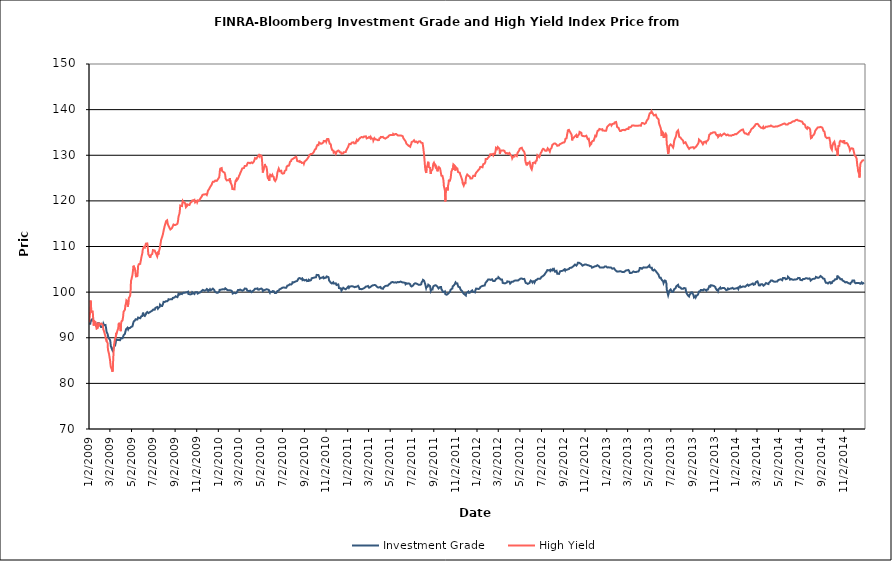
| Category | Investment Grade | High Yield |
|---|---|---|
| 1/2/09 | 93.046 | 93.384 |
| 1/5/09 | 93.049 | 95.884 |
| 1/6/09 | 93.475 | 98.139 |
| 1/7/09 | 93.709 | 97.71 |
| 1/8/09 | 93.718 | 95.533 |
| 1/9/09 | 93.985 | 95.816 |
| 1/12/09 | 94.097 | 95.762 |
| 1/13/09 | 93.983 | 94.686 |
| 1/14/09 | 93.92 | 93.286 |
| 1/15/09 | 93.546 | 92.655 |
| 1/16/09 | 93.671 | 93.669 |
| 1/20/09 | 93.14 | 93.418 |
| 1/21/09 | 92.925 | 93.023 |
| 1/22/09 | 92.583 | 92.395 |
| 1/23/09 | 92.491 | 91.995 |
| 1/26/09 | 92.535 | 92.134 |
| 1/27/09 | 92.931 | 92.144 |
| 1/28/09 | 93.364 | 93.304 |
| 1/29/09 | 93.001 | 93.191 |
| 1/30/09 | 92.791 | 92.696 |
| 2/2/09 | 92.882 | 92.996 |
| 2/3/09 | 92.637 | 92.918 |
| 2/4/09 | 92.379 | 93.053 |
| 2/5/09 | 92.294 | 93.127 |
| 2/6/09 | 92.318 | 93.083 |
| 2/9/09 | 92.344 | 92.836 |
| 2/10/09 | 92.826 | 92.698 |
| 2/11/09 | 93.112 | 91.824 |
| 2/12/09 | 93.017 | 91.606 |
| 2/13/09 | 92.764 | 91.393 |
| 2/17/09 | 92.806 | 90.299 |
| 2/18/09 | 92.404 | 89.67 |
| 2/19/09 | 91.948 | 89.9 |
| 2/20/09 | 91.302 | 89.233 |
| 2/23/09 | 90.863 | 88.885 |
| 2/24/09 | 90.44 | 87.376 |
| 2/25/09 | 90.154 | 87.339 |
| 2/26/09 | 89.975 | 87.524 |
| 2/27/09 | 89.852 | 86.478 |
| 3/2/09 | 89.476 | 85.02 |
| 3/3/09 | 89.055 | 84.259 |
| 3/4/09 | 88.198 | 83.636 |
| 3/5/09 | 87.979 | 83.569 |
| 3/6/09 | 87.845 | 83.252 |
| 3/9/09 | 87.196 | 82.542 |
| 3/10/09 | 87.218 | 83.855 |
| 3/11/09 | 87.46 | 85.554 |
| 3/12/09 | 87.764 | 87.06 |
| 3/13/09 | 88.258 | 88.329 |
| 3/16/09 | 88.272 | 89.854 |
| 3/17/09 | 88.372 | 89.896 |
| 3/18/09 | 88.919 | 90.118 |
| 3/19/09 | 89.64 | 91.095 |
| 3/20/09 | 89.443 | 90.814 |
| 3/23/09 | 89.512 | 91.642 |
| 3/24/09 | 89.466 | 91.703 |
| 3/25/09 | 89.433 | 92.049 |
| 3/26/09 | 89.521 | 92.951 |
| 3/27/09 | 89.705 | 93.274 |
| 3/30/09 | 89.455 | 92.469 |
| 3/31/09 | 89.615 | 92.327 |
| 4/1/09 | 89.672 | 91.447 |
| 4/2/09 | 89.883 | 93.017 |
| 4/3/09 | 89.748 | 93.575 |
| 4/6/09 | 89.88 | 93.801 |
| 4/7/09 | 89.967 | 94.252 |
| 4/8/09 | 90.298 | 94.749 |
| 4/9/09 | 90.527 | 95.685 |
| 4/13/09 | 90.891 | 96.175 |
| 4/14/09 | 91.268 | 97.038 |
| 4/15/09 | 91.545 | 96.985 |
| 4/16/09 | 91.842 | 97.579 |
| 4/17/09 | 92.015 | 98.223 |
| 4/20/09 | 92.183 | 98.037 |
| 4/21/09 | 92.024 | 96.806 |
| 4/22/09 | 91.82 | 97.228 |
| 4/23/09 | 91.922 | 97.456 |
| 4/24/09 | 92.114 | 98.694 |
| 4/27/09 | 92.136 | 99.12 |
| 4/28/09 | 92.124 | 99.355 |
| 4/29/09 | 92.267 | 100.493 |
| 4/30/09 | 92.365 | 102.465 |
| 5/1/09 | 92.375 | 102.702 |
| 5/4/09 | 92.495 | 103.726 |
| 5/5/09 | 92.789 | 104.282 |
| 5/6/09 | 93.129 | 105.004 |
| 5/7/09 | 93.372 | 105.794 |
| 5/8/09 | 93.6 | 105.722 |
| 5/11/09 | 93.779 | 105.05 |
| 5/12/09 | 93.96 | 104.733 |
| 5/13/09 | 94.041 | 104.064 |
| 5/14/09 | 93.916 | 103.447 |
| 5/15/09 | 94.086 | 103.407 |
| 5/18/09 | 94 | 103.509 |
| 5/19/09 | 94.058 | 104.332 |
| 5/20/09 | 94.43 | 105.679 |
| 5/21/09 | 94.416 | 105.772 |
| 5/22/09 | 94.366 | 106.114 |
| 5/26/09 | 94.273 | 106.193 |
| 5/27/09 | 94.248 | 106.702 |
| 5/28/09 | 94.182 | 106.98 |
| 5/29/09 | 94.698 | 107.538 |
| 6/1/09 | 94.766 | 108.487 |
| 6/2/09 | 95.131 | 109.26 |
| 6/3/09 | 95.498 | 109.24 |
| 6/4/09 | 95.301 | 109.279 |
| 6/5/09 | 94.935 | 109.888 |
| 6/8/09 | 94.77 | 109.759 |
| 6/9/09 | 94.929 | 109.861 |
| 6/10/09 | 94.939 | 110.333 |
| 6/11/09 | 95.142 | 110.634 |
| 6/12/09 | 95.402 | 110.815 |
| 6/15/09 | 95.623 | 110.676 |
| 6/16/09 | 95.67 | 110.228 |
| 6/17/09 | 95.691 | 109.146 |
| 6/18/09 | 95.399 | 108.309 |
| 6/19/09 | 95.443 | 108.448 |
| 6/22/09 | 95.594 | 107.775 |
| 6/23/09 | 95.659 | 107.525 |
| 6/24/09 | 95.636 | 107.874 |
| 6/25/09 | 95.746 | 107.911 |
| 6/26/09 | 95.946 | 108.186 |
| 6/29/09 | 95.945 | 108.376 |
| 6/30/09 | 95.921 | 108.789 |
| 7/1/09 | 96.003 | 109.206 |
| 7/2/09 | 96.182 | 109.406 |
| 7/6/09 | 96.153 | 109.117 |
| 7/7/09 | 96.272 | 109.134 |
| 7/8/09 | 96.542 | 108.697 |
| 7/9/09 | 96.516 | 108.509 |
| 7/10/09 | 96.67 | 108.411 |
| 7/13/09 | 96.732 | 107.832 |
| 7/14/09 | 96.599 | 108.205 |
| 7/15/09 | 96.363 | 108.875 |
| 7/16/09 | 96.563 | 108.21 |
| 7/17/09 | 96.594 | 108.698 |
| 7/20/09 | 96.772 | 109.528 |
| 7/21/09 | 97.252 | 109.932 |
| 7/22/09 | 97.248 | 109.982 |
| 7/23/09 | 97.034 | 110.913 |
| 7/24/09 | 96.997 | 111.456 |
| 7/27/09 | 96.955 | 112.11 |
| 7/28/09 | 97.153 | 112.406 |
| 7/29/09 | 97.334 | 112.65 |
| 7/30/09 | 97.408 | 113.036 |
| 7/31/09 | 97.86 | 113.46 |
| 8/3/09 | 97.829 | 114.476 |
| 8/4/09 | 97.856 | 114.731 |
| 8/5/09 | 97.963 | 114.79 |
| 8/6/09 | 97.987 | 115.221 |
| 8/7/09 | 97.828 | 115.565 |
| 8/10/09 | 98.002 | 115.741 |
| 8/11/09 | 98.141 | 115.533 |
| 8/12/09 | 97.986 | 114.874 |
| 8/13/09 | 98.218 | 114.945 |
| 8/14/09 | 98.442 | 114.835 |
| 8/17/09 | 98.39 | 114.028 |
| 8/18/09 | 98.4 | 114.038 |
| 8/19/09 | 98.41 | 113.726 |
| 8/20/09 | 98.446 | 113.881 |
| 8/21/09 | 98.305 | 113.895 |
| 8/24/09 | 98.431 | 114.076 |
| 8/25/09 | 98.596 | 114.251 |
| 8/26/09 | 98.732 | 114.472 |
| 8/27/09 | 98.695 | 114.602 |
| 8/28/09 | 98.743 | 114.82 |
| 8/31/09 | 98.832 | 114.697 |
| 9/1/09 | 98.91 | 114.882 |
| 9/2/09 | 99.024 | 114.76 |
| 9/3/09 | 99.086 | 114.735 |
| 9/4/09 | 99.037 | 114.949 |
| 9/8/09 | 98.902 | 114.966 |
| 9/9/09 | 98.868 | 115.29 |
| 9/10/09 | 99.275 | 115.746 |
| 9/11/09 | 99.63 | 116.507 |
| 9/14/09 | 99.465 | 117.283 |
| 9/15/09 | 99.509 | 117.986 |
| 9/16/09 | 99.637 | 118.978 |
| 9/17/09 | 99.682 | 118.863 |
| 9/18/09 | 99.677 | 118.972 |
| 9/21/09 | 99.578 | 118.867 |
| 9/22/09 | 99.615 | 119.476 |
| 9/23/09 | 99.677 | 119.925 |
| 9/24/09 | 99.835 | 119.779 |
| 9/25/09 | 99.768 | 119.622 |
| 9/28/09 | 99.868 | 119.663 |
| 9/29/09 | 99.826 | 119.763 |
| 9/30/09 | 99.757 | 119.41 |
| 10/1/09 | 99.904 | 119.082 |
| 10/2/09 | 99.914 | 118.616 |
| 10/5/09 | 99.98 | 118.885 |
| 10/6/09 | 99.975 | 119.229 |
| 10/7/09 | 100.087 | 119.03 |
| 10/8/09 | 100.089 | 119.186 |
| 10/9/09 | 99.596 | 119.138 |
| 10/12/09 | 99.549 | 119.102 |
| 10/13/09 | 99.766 | 119.083 |
| 10/14/09 | 99.64 | 119.441 |
| 10/15/09 | 99.494 | 119.517 |
| 10/16/09 | 99.538 | 119.694 |
| 10/19/09 | 99.609 | 119.838 |
| 10/20/09 | 99.952 | 120.101 |
| 10/21/09 | 99.821 | 120.17 |
| 10/22/09 | 99.853 | 120.154 |
| 10/23/09 | 99.747 | 120.141 |
| 10/26/09 | 99.587 | 120.241 |
| 10/27/09 | 99.767 | 120.107 |
| 10/28/09 | 99.948 | 119.659 |
| 10/29/09 | 99.742 | 119.547 |
| 10/30/09 | 100 | 119.579 |
| 11/2/09 | 100.004 | 120.016 |
| 11/3/09 | 99.815 | 119.705 |
| 11/4/09 | 99.683 | 119.877 |
| 11/5/09 | 99.678 | 120.075 |
| 11/6/09 | 99.806 | 120.007 |
| 11/9/09 | 99.89 | 120.129 |
| 11/10/09 | 99.993 | 120.314 |
| 11/11/09 | 99.828 | 120.433 |
| 11/12/09 | 99.959 | 120.398 |
| 11/13/09 | 100.034 | 120.493 |
| 11/16/09 | 100.303 | 120.991 |
| 11/17/09 | 100.436 | 121.234 |
| 11/18/09 | 100.437 | 121.449 |
| 11/19/09 | 100.485 | 121.419 |
| 11/20/09 | 100.415 | 121.398 |
| 11/23/09 | 100.318 | 121.412 |
| 11/24/09 | 100.461 | 121.467 |
| 11/25/09 | 100.464 | 121.62 |
| 11/27/09 | 100.4 | 121.478 |
| 11/30/09 | 100.681 | 121.265 |
| 12/1/09 | 100.653 | 121.495 |
| 12/2/09 | 100.639 | 121.788 |
| 12/3/09 | 100.507 | 122.183 |
| 12/4/09 | 100.204 | 122.288 |
| 12/7/09 | 100.412 | 122.671 |
| 12/8/09 | 100.612 | 122.734 |
| 12/9/09 | 100.64 | 122.82 |
| 12/10/09 | 100.549 | 123.115 |
| 12/11/09 | 100.415 | 123.275 |
| 12/14/09 | 100.556 | 123.59 |
| 12/15/09 | 100.456 | 123.888 |
| 12/16/09 | 100.51 | 124.099 |
| 12/17/09 | 100.756 | 124.185 |
| 12/18/09 | 100.804 | 124.076 |
| 12/21/09 | 100.456 | 124.216 |
| 12/22/09 | 100.197 | 124.354 |
| 12/23/09 | 100.197 | 124.34 |
| 12/24/09 | 100.077 | 124.454 |
| 12/28/09 | 99.846 | 124.37 |
| 12/29/09 | 99.856 | 124.526 |
| 12/30/09 | 100.027 | 124.596 |
| 12/31/09 | 99.868 | 124.726 |
| 1/4/10 | 100.102 | 125.163 |
| 1/5/10 | 100.49 | 125.873 |
| 1/6/10 | 100.447 | 126.69 |
| 1/7/10 | 100.503 | 127.071 |
| 1/8/10 | 100.542 | 127.104 |
| 1/11/10 | 100.559 | 127.199 |
| 1/12/10 | 100.775 | 126.595 |
| 1/13/10 | 100.668 | 126.609 |
| 1/14/10 | 100.647 | 126.495 |
| 1/15/10 | 100.825 | 126.376 |
| 1/19/10 | 100.604 | 126.186 |
| 1/20/10 | 100.724 | 126.008 |
| 1/21/10 | 100.842 | 125.662 |
| 1/22/10 | 100.705 | 124.921 |
| 1/25/10 | 100.59 | 124.498 |
| 1/26/10 | 100.603 | 124.395 |
| 1/27/10 | 100.508 | 124.599 |
| 1/28/10 | 100.405 | 124.548 |
| 1/29/10 | 100.417 | 124.508 |
| 2/1/10 | 100.394 | 124.505 |
| 2/2/10 | 100.469 | 124.725 |
| 2/3/10 | 100.363 | 124.969 |
| 2/4/10 | 100.396 | 124.762 |
| 2/5/10 | 100.385 | 123.977 |
| 2/8/10 | 100.291 | 123.526 |
| 2/9/10 | 100.167 | 123.238 |
| 2/10/10 | 99.997 | 122.602 |
| 2/11/10 | 99.691 | 122.473 |
| 2/12/10 | 99.896 | 122.576 |
| 2/16/10 | 99.868 | 122.529 |
| 2/17/10 | 99.849 | 123.433 |
| 2/18/10 | 99.79 | 123.864 |
| 2/19/10 | 99.757 | 124.339 |
| 2/22/10 | 99.858 | 124.755 |
| 2/23/10 | 100.056 | 124.527 |
| 2/24/10 | 100.143 | 124.602 |
| 2/25/10 | 100.208 | 124.538 |
| 2/26/10 | 100.466 | 124.842 |
| 3/1/10 | 100.447 | 125.466 |
| 3/2/10 | 100.481 | 125.66 |
| 3/3/10 | 100.547 | 125.78 |
| 3/4/10 | 100.572 | 125.898 |
| 3/5/10 | 100.406 | 126.217 |
| 3/8/10 | 100.383 | 126.711 |
| 3/9/10 | 100.445 | 126.852 |
| 3/10/10 | 100.329 | 127.106 |
| 3/11/10 | 100.316 | 127.14 |
| 3/12/10 | 100.488 | 127.262 |
| 3/15/10 | 100.522 | 127.212 |
| 3/16/10 | 100.654 | 127.15 |
| 3/17/10 | 100.794 | 127.664 |
| 3/18/10 | 100.787 | 127.842 |
| 3/19/10 | 100.77 | 127.776 |
| 3/22/10 | 100.728 | 127.676 |
| 3/23/10 | 100.762 | 127.779 |
| 3/24/10 | 100.328 | 128.048 |
| 3/25/10 | 100.142 | 128.082 |
| 3/26/10 | 100.176 | 128.355 |
| 3/29/10 | 100.218 | 128.357 |
| 3/30/10 | 100.26 | 128.526 |
| 3/31/10 | 100.4 | 128.354 |
| 4/1/10 | 100.318 | 128.234 |
| 4/5/10 | 99.992 | 128.435 |
| 4/6/10 | 99.974 | 128.282 |
| 4/7/10 | 100.148 | 128.468 |
| 4/8/10 | 100.17 | 128.282 |
| 4/9/10 | 100.252 | 128.463 |
| 4/12/10 | 100.46 | 128.647 |
| 4/13/10 | 100.602 | 128.822 |
| 4/14/10 | 100.658 | 129.085 |
| 4/15/10 | 100.72 | 129.378 |
| 4/16/10 | 100.861 | 129.541 |
| 4/19/10 | 100.72 | 129.254 |
| 4/20/10 | 100.713 | 129.364 |
| 4/21/10 | 100.841 | 129.516 |
| 4/22/10 | 100.818 | 129.413 |
| 4/23/10 | 100.588 | 129.707 |
| 4/26/10 | 100.539 | 130.023 |
| 4/27/10 | 100.749 | 129.974 |
| 4/28/10 | 100.637 | 129.76 |
| 4/29/10 | 100.695 | 130.026 |
| 4/30/10 | 100.908 | 129.932 |
| 5/3/10 | 100.788 | 129.878 |
| 5/4/10 | 100.905 | 129.637 |
| 5/5/10 | 100.862 | 128.685 |
| 5/6/10 | 100.609 | 127.446 |
| 5/7/10 | 100.233 | 126.211 |
| 5/10/10 | 100.404 | 127.273 |
| 5/11/10 | 100.358 | 127.056 |
| 5/12/10 | 100.306 | 127.684 |
| 5/13/10 | 100.48 | 128.088 |
| 5/14/10 | 100.68 | 127.605 |
| 5/17/10 | 100.617 | 127.473 |
| 5/18/10 | 100.721 | 127.395 |
| 5/19/10 | 100.652 | 126.706 |
| 5/20/10 | 100.6 | 125.442 |
| 5/21/10 | 100.415 | 125.086 |
| 5/24/10 | 100.481 | 125.319 |
| 5/25/10 | 100.136 | 124.396 |
| 5/26/10 | 100.104 | 124.91 |
| 5/27/10 | 99.874 | 125.323 |
| 5/28/10 | 100.099 | 125.704 |
| 6/1/10 | 100.03 | 125.412 |
| 6/2/10 | 99.906 | 125.392 |
| 6/3/10 | 99.946 | 125.704 |
| 6/4/10 | 100.231 | 125.471 |
| 6/7/10 | 100.206 | 125.2 |
| 6/8/10 | 100.11 | 124.677 |
| 6/9/10 | 100.083 | 124.67 |
| 6/10/10 | 99.801 | 124.634 |
| 6/11/10 | 99.808 | 124.35 |
| 6/14/10 | 99.829 | 124.765 |
| 6/15/10 | 99.86 | 125.1 |
| 6/16/10 | 99.92 | 125.477 |
| 6/17/10 | 100.239 | 126.08 |
| 6/18/10 | 100.29 | 126.379 |
| 6/21/10 | 100.344 | 127.069 |
| 6/22/10 | 100.487 | 126.885 |
| 6/23/10 | 100.61 | 126.856 |
| 6/24/10 | 100.569 | 126.505 |
| 6/25/10 | 100.558 | 126.6 |
| 6/28/10 | 100.784 | 126.599 |
| 6/29/10 | 100.881 | 126.131 |
| 6/30/10 | 100.978 | 126.332 |
| 7/1/10 | 100.965 | 125.953 |
| 7/2/10 | 100.974 | 125.967 |
| 7/6/10 | 101.028 | 126.06 |
| 7/7/10 | 100.928 | 126.207 |
| 7/8/10 | 100.951 | 126.563 |
| 7/9/10 | 100.945 | 126.756 |
| 7/12/10 | 100.939 | 126.793 |
| 7/13/10 | 100.992 | 127.434 |
| 7/14/10 | 100.998 | 127.449 |
| 7/15/10 | 101.414 | 127.578 |
| 7/16/10 | 101.574 | 127.717 |
| 7/19/10 | 101.508 | 127.688 |
| 7/20/10 | 101.593 | 127.776 |
| 7/21/10 | 101.672 | 127.949 |
| 7/22/10 | 101.721 | 128.3 |
| 7/23/10 | 101.691 | 128.582 |
| 7/26/10 | 101.665 | 128.726 |
| 7/27/10 | 101.716 | 129.049 |
| 7/28/10 | 101.723 | 129.168 |
| 7/29/10 | 101.885 | 128.993 |
| 7/30/10 | 102.177 | 129.176 |
| 8/2/10 | 102.135 | 129.303 |
| 8/3/10 | 102.299 | 129.487 |
| 8/4/10 | 102.207 | 129.465 |
| 8/5/10 | 102.25 | 129.5 |
| 8/6/10 | 102.431 | 129.631 |
| 8/9/10 | 102.373 | 129.675 |
| 8/10/10 | 102.438 | 129.445 |
| 8/11/10 | 102.495 | 129.168 |
| 8/12/10 | 102.453 | 128.755 |
| 8/13/10 | 102.521 | 128.568 |
| 8/16/10 | 102.995 | 128.643 |
| 8/17/10 | 102.924 | 128.731 |
| 8/18/10 | 102.975 | 128.831 |
| 8/19/10 | 103.087 | 128.733 |
| 8/20/10 | 102.992 | 128.508 |
| 8/23/10 | 102.902 | 128.534 |
| 8/24/10 | 103.11 | 128.37 |
| 8/25/10 | 103.069 | 128.303 |
| 8/26/10 | 103.004 | 128.195 |
| 8/27/10 | 102.638 | 128.262 |
| 8/30/10 | 102.77 | 128.382 |
| 8/31/10 | 102.91 | 128.147 |
| 9/1/10 | 102.667 | 128.36 |
| 9/2/10 | 102.558 | 128.62 |
| 9/3/10 | 102.437 | 128.836 |
| 9/7/10 | 102.695 | 128.945 |
| 9/8/10 | 102.694 | 128.974 |
| 9/9/10 | 102.414 | 129.155 |
| 9/10/10 | 102.242 | 129.258 |
| 9/13/10 | 102.438 | 129.602 |
| 9/14/10 | 102.704 | 129.521 |
| 9/15/10 | 102.649 | 129.674 |
| 9/16/10 | 102.499 | 130.074 |
| 9/17/10 | 102.528 | 130.135 |
| 9/20/10 | 102.632 | 130.295 |
| 9/21/10 | 102.768 | 130.466 |
| 9/22/10 | 103.038 | 130.485 |
| 9/23/10 | 103.079 | 130.298 |
| 9/24/10 | 102.892 | 130.335 |
| 9/27/10 | 103.136 | 130.598 |
| 9/28/10 | 103.196 | 130.688 |
| 9/29/10 | 103.217 | 130.894 |
| 9/30/10 | 103.213 | 131.102 |
| 10/1/10 | 103.293 | 131.255 |
| 10/4/10 | 103.25 | 131.415 |
| 10/5/10 | 103.36 | 131.667 |
| 10/6/10 | 103.777 | 131.956 |
| 10/7/10 | 103.821 | 132.099 |
| 10/8/10 | 103.882 | 132.244 |
| 10/11/10 | 103.749 | 132.212 |
| 10/12/10 | 103.668 | 132.314 |
| 10/13/10 | 103.535 | 132.793 |
| 10/14/10 | 103.235 | 132.644 |
| 10/15/10 | 102.972 | 132.584 |
| 10/18/10 | 103.11 | 132.508 |
| 10/19/10 | 103.211 | 132.456 |
| 10/20/10 | 103.237 | 132.329 |
| 10/21/10 | 103.168 | 132.579 |
| 10/22/10 | 103.146 | 132.563 |
| 10/25/10 | 103.321 | 132.824 |
| 10/26/10 | 103.025 | 133.129 |
| 10/27/10 | 102.808 | 133.066 |
| 10/28/10 | 102.914 | 133.18 |
| 10/29/10 | 103.11 | 133.087 |
| 11/1/10 | 103.142 | 133.192 |
| 11/2/10 | 103.332 | 132.962 |
| 11/3/10 | 103.438 | 133.19 |
| 11/4/10 | 103.58 | 133.536 |
| 11/5/10 | 103.406 | 133.536 |
| 11/8/10 | 103.31 | 133.557 |
| 11/9/10 | 103.055 | 133.593 |
| 11/10/10 | 102.564 | 133.022 |
| 11/11/10 | 102.616 | 132.97 |
| 11/12/10 | 102.468 | 132.524 |
| 11/15/10 | 102.045 | 132.371 |
| 11/16/10 | 101.932 | 131.763 |
| 11/17/10 | 102.112 | 131.511 |
| 11/18/10 | 101.897 | 131.639 |
| 11/19/10 | 102.054 | 131.122 |
| 11/22/10 | 102.165 | 131.019 |
| 11/23/10 | 102.278 | 130.588 |
| 11/24/10 | 101.864 | 130.542 |
| 11/26/10 | 101.863 | 130.744 |
| 11/29/10 | 101.922 | 130.291 |
| 11/30/10 | 102.022 | 130.145 |
| 12/1/10 | 101.568 | 130.481 |
| 12/2/10 | 101.476 | 130.838 |
| 12/3/10 | 101.519 | 130.961 |
| 12/6/10 | 101.694 | 131.045 |
| 12/7/10 | 101.352 | 131.156 |
| 12/8/10 | 100.876 | 130.842 |
| 12/9/10 | 100.991 | 130.879 |
| 12/10/10 | 100.934 | 130.643 |
| 12/13/10 | 100.857 | 130.642 |
| 12/14/10 | 100.596 | 130.565 |
| 12/15/10 | 100.33 | 130.335 |
| 12/16/10 | 100.307 | 130.398 |
| 12/17/10 | 100.602 | 130.396 |
| 12/20/10 | 100.943 | 130.42 |
| 12/21/10 | 100.841 | 130.656 |
| 12/22/10 | 100.868 | 130.633 |
| 12/23/10 | 100.766 | 130.815 |
| 12/27/10 | 100.627 | 130.708 |
| 12/28/10 | 100.526 | 130.99 |
| 12/29/10 | 100.688 | 131.074 |
| 12/30/10 | 100.846 | 131.261 |
| 12/31/10 | 101.042 | 131.455 |
| 1/3/11 | 101.208 | 131.858 |
| 1/4/11 | 101.316 | 132.091 |
| 1/5/11 | 100.937 | 132.302 |
| 1/6/11 | 100.955 | 132.482 |
| 1/7/11 | 101.214 | 132.404 |
| 1/10/11 | 101.247 | 132.434 |
| 1/11/11 | 101.24 | 132.58 |
| 1/12/11 | 101.18 | 132.636 |
| 1/13/11 | 101.307 | 132.753 |
| 1/14/11 | 101.392 | 132.788 |
| 1/18/11 | 101.21 | 132.849 |
| 1/19/11 | 101.349 | 132.835 |
| 1/20/11 | 101.094 | 132.594 |
| 1/21/11 | 101.074 | 132.574 |
| 1/24/11 | 101.163 | 132.632 |
| 1/25/11 | 101.328 | 132.944 |
| 1/26/11 | 101.147 | 133.021 |
| 1/27/11 | 101.186 | 133.283 |
| 1/28/11 | 101.332 | 133.054 |
| 1/31/11 | 101.371 | 133.197 |
| 2/1/11 | 101.177 | 133.376 |
| 2/2/11 | 101.113 | 133.508 |
| 2/3/11 | 100.901 | 133.416 |
| 2/4/11 | 100.688 | 133.653 |
| 2/7/11 | 100.708 | 133.883 |
| 2/8/11 | 100.678 | 134.026 |
| 2/9/11 | 100.64 | 134.065 |
| 2/10/11 | 100.635 | 134.006 |
| 2/11/11 | 100.689 | 133.906 |
| 2/14/11 | 100.76 | 133.89 |
| 2/15/11 | 100.792 | 133.913 |
| 2/16/11 | 100.816 | 134.016 |
| 2/17/11 | 100.877 | 134.107 |
| 2/18/11 | 100.849 | 134.178 |
| 2/22/11 | 101.209 | 134.145 |
| 2/23/11 | 101.204 | 133.96 |
| 2/24/11 | 101.068 | 133.689 |
| 2/25/11 | 101.217 | 133.737 |
| 2/28/11 | 101.347 | 133.797 |
| 3/1/11 | 101.398 | 133.935 |
| 3/2/11 | 101.379 | 133.992 |
| 3/3/11 | 100.969 | 134.003 |
| 3/4/11 | 101.076 | 133.893 |
| 3/7/11 | 101.137 | 133.668 |
| 3/8/11 | 101.019 | 133.964 |
| 3/9/11 | 101.172 | 133.956 |
| 3/10/11 | 101.344 | 133.656 |
| 3/11/11 | 101.44 | 133.576 |
| 3/14/11 | 101.514 | 133.638 |
| 3/15/11 | 101.535 | 133.214 |
| 3/16/11 | 101.719 | 133.178 |
| 3/17/11 | 101.535 | 133.421 |
| 3/18/11 | 101.606 | 133.749 |
| 3/21/11 | 101.533 | 133.484 |
| 3/22/11 | 101.512 | 133.544 |
| 3/23/11 | 101.421 | 133.408 |
| 3/24/11 | 101.267 | 133.44 |
| 3/25/11 | 101.138 | 133.353 |
| 3/28/11 | 101.016 | 133.284 |
| 3/29/11 | 100.882 | 133.292 |
| 3/30/11 | 100.871 | 133.463 |
| 3/31/11 | 101.038 | 133.352 |
| 4/1/11 | 100.887 | 133.702 |
| 4/4/11 | 101.136 | 133.797 |
| 4/5/11 | 100.963 | 134.02 |
| 4/6/11 | 100.836 | 133.92 |
| 4/7/11 | 100.781 | 133.902 |
| 4/8/11 | 100.76 | 134.004 |
| 4/11/11 | 100.727 | 134.028 |
| 4/12/11 | 100.924 | 133.848 |
| 4/13/11 | 101.032 | 133.808 |
| 4/14/11 | 101.001 | 133.714 |
| 4/15/11 | 101.239 | 133.871 |
| 4/18/11 | 101.36 | 133.65 |
| 4/19/11 | 101.451 | 133.651 |
| 4/20/11 | 101.424 | 133.737 |
| 4/21/11 | 101.387 | 133.825 |
| 4/25/11 | 101.419 | 133.988 |
| 4/26/11 | 101.611 | 134.092 |
| 4/27/11 | 101.48 | 134.04 |
| 4/28/11 | 101.708 | 134.311 |
| 4/29/11 | 101.828 | 134.333 |
| 5/2/11 | 101.906 | 134.443 |
| 5/3/11 | 101.997 | 134.32 |
| 5/4/11 | 102.075 | 134.479 |
| 5/5/11 | 102.171 | 134.418 |
| 5/6/11 | 102.158 | 134.578 |
| 5/9/11 | 102.209 | 134.425 |
| 5/10/11 | 102.082 | 134.688 |
| 5/11/11 | 102.109 | 134.7 |
| 5/12/11 | 102.099 | 134.527 |
| 5/13/11 | 102.138 | 134.491 |
| 5/16/11 | 102.149 | 134.632 |
| 5/17/11 | 102.353 | 134.587 |
| 5/18/11 | 102.212 | 134.566 |
| 5/19/11 | 102.07 | 134.636 |
| 5/20/11 | 102.132 | 134.542 |
| 5/23/11 | 102.226 | 134.352 |
| 5/24/11 | 102.138 | 134.411 |
| 5/25/11 | 102.088 | 134.326 |
| 5/26/11 | 102.164 | 134.342 |
| 5/27/11 | 102.195 | 134.51 |
| 5/31/11 | 102.313 | 134.338 |
| 6/1/11 | 102.499 | 134.385 |
| 6/2/11 | 102.253 | 134.221 |
| 6/3/11 | 102.189 | 134.283 |
| 6/6/11 | 102.12 | 134.159 |
| 6/7/11 | 102.072 | 133.967 |
| 6/8/11 | 102.173 | 133.704 |
| 6/9/11 | 102.106 | 133.568 |
| 6/10/11 | 102.076 | 133.506 |
| 6/13/11 | 102.012 | 133.153 |
| 6/14/11 | 101.73 | 133.037 |
| 6/15/11 | 101.868 | 132.872 |
| 6/16/11 | 101.948 | 132.554 |
| 6/17/11 | 101.926 | 132.653 |
| 6/20/11 | 101.853 | 132.269 |
| 6/21/11 | 101.876 | 132.267 |
| 6/22/11 | 101.873 | 132.44 |
| 6/23/11 | 101.908 | 132.05 |
| 6/24/11 | 102.002 | 132.113 |
| 6/27/11 | 101.741 | 131.865 |
| 6/28/11 | 101.402 | 132.191 |
| 6/29/11 | 101.26 | 132.363 |
| 6/30/11 | 101.2 | 132.454 |
| 7/1/11 | 101.237 | 132.902 |
| 7/5/11 | 101.449 | 133.029 |
| 7/6/11 | 101.506 | 133.115 |
| 7/7/11 | 101.395 | 133.231 |
| 7/8/11 | 101.8 | 133.28 |
| 7/11/11 | 101.933 | 132.888 |
| 7/12/11 | 102.014 | 132.784 |
| 7/13/11 | 102.042 | 132.957 |
| 7/14/11 | 101.89 | 132.999 |
| 7/15/11 | 101.851 | 132.866 |
| 7/18/11 | 101.732 | 132.724 |
| 7/19/11 | 101.677 | 132.722 |
| 7/20/11 | 101.802 | 132.936 |
| 7/21/11 | 101.598 | 133.028 |
| 7/22/11 | 101.707 | 133.068 |
| 7/25/11 | 101.6 | 133.049 |
| 7/26/11 | 101.668 | 133.246 |
| 7/27/11 | 101.671 | 132.951 |
| 7/28/11 | 101.71 | 132.748 |
| 7/29/11 | 102.101 | 132.541 |
| 8/1/11 | 102.445 | 132.668 |
| 8/2/11 | 102.69 | 132.126 |
| 8/3/11 | 102.765 | 131.582 |
| 8/4/11 | 102.858 | 130.856 |
| 8/5/11 | 102.526 | 130.297 |
| 8/8/11 | 101.818 | 127.319 |
| 8/9/11 | 101.642 | 126.715 |
| 8/10/11 | 101.666 | 126.678 |
| 8/11/11 | 100.881 | 126.106 |
| 8/12/11 | 101.126 | 127.015 |
| 8/15/11 | 101.191 | 127.903 |
| 8/16/11 | 101.405 | 128.042 |
| 8/17/11 | 101.631 | 128.573 |
| 8/18/11 | 101.692 | 127.705 |
| 8/19/11 | 101.529 | 127.395 |
| 8/22/11 | 101.314 | 127.264 |
| 8/23/11 | 100.821 | 126.282 |
| 8/24/11 | 100.273 | 125.927 |
| 8/25/11 | 100.448 | 126.498 |
| 8/26/11 | 100.592 | 126.715 |
| 8/29/11 | 100.573 | 126.885 |
| 8/30/11 | 101.003 | 127.033 |
| 8/31/11 | 101.14 | 128.078 |
| 9/1/11 | 101.324 | 128.205 |
| 9/2/11 | 101.474 | 128.365 |
| 9/6/11 | 101.516 | 127.515 |
| 9/7/11 | 101.486 | 127.765 |
| 9/8/11 | 101.502 | 127.727 |
| 9/9/11 | 101.426 | 127.519 |
| 9/12/11 | 101.178 | 126.474 |
| 9/13/11 | 100.959 | 126.623 |
| 9/14/11 | 100.983 | 127.097 |
| 9/15/11 | 100.799 | 127.314 |
| 9/16/11 | 100.88 | 127.409 |
| 9/19/11 | 101.097 | 127.172 |
| 9/20/11 | 101.095 | 127.29 |
| 9/21/11 | 101.153 | 127.116 |
| 9/22/11 | 101.108 | 125.995 |
| 9/23/11 | 100.647 | 125.52 |
| 9/26/11 | 100.298 | 125.465 |
| 9/27/11 | 100.058 | 125.611 |
| 9/28/11 | 99.924 | 124.851 |
| 9/29/11 | 99.972 | 124.344 |
| 9/30/11 | 99.996 | 123.273 |
| 10/3/11 | 100.148 | 122.236 |
| 10/4/11 | 99.594 | 119.881 |
| 10/5/11 | 99.418 | 120.775 |
| 10/6/11 | 99.443 | 122.277 |
| 10/7/11 | 99.434 | 122.768 |
| 10/10/11 | 99.517 | 122.852 |
| 10/11/11 | 99.353 | 122.3 |
| 10/12/11 | 99.527 | 123.376 |
| 10/13/11 | 99.78 | 123.672 |
| 10/14/11 | 99.81 | 124.466 |
| 10/17/11 | 100.031 | 124.417 |
| 10/18/11 | 100.25 | 124.296 |
| 10/19/11 | 100.53 | 124.939 |
| 10/20/11 | 100.68 | 125.541 |
| 10/21/11 | 100.707 | 126.394 |
| 10/24/11 | 100.807 | 126.914 |
| 10/25/11 | 101.264 | 127.167 |
| 10/26/11 | 101.368 | 126.792 |
| 10/27/11 | 101.348 | 127.975 |
| 10/28/11 | 101.463 | 127.875 |
| 10/31/11 | 101.784 | 127.696 |
| 11/1/11 | 101.959 | 126.648 |
| 11/2/11 | 102.125 | 126.978 |
| 11/3/11 | 102.008 | 127.376 |
| 11/4/11 | 101.874 | 127.162 |
| 11/7/11 | 101.905 | 127.097 |
| 11/8/11 | 101.595 | 127.239 |
| 11/9/11 | 101.39 | 126.322 |
| 11/10/11 | 101.173 | 126.414 |
| 11/11/11 | 101.238 | 126.491 |
| 11/14/11 | 101.069 | 126.17 |
| 11/15/11 | 100.767 | 125.82 |
| 11/16/11 | 100.761 | 125.629 |
| 11/17/11 | 100.469 | 125.434 |
| 11/18/11 | 100.413 | 125.196 |
| 11/21/11 | 100.183 | 124.532 |
| 11/22/11 | 99.951 | 123.879 |
| 11/23/11 | 99.805 | 123.809 |
| 11/25/11 | 99.664 | 123.358 |
| 11/28/11 | 99.47 | 124.094 |
| 11/29/11 | 99.414 | 123.689 |
| 11/30/11 | 99.404 | 124.084 |
| 12/1/11 | 99.27 | 124.86 |
| 12/2/11 | 99.785 | 125.29 |
| 12/5/11 | 99.93 | 125.775 |
| 12/6/11 | 99.982 | 125.795 |
| 12/7/11 | 99.949 | 125.612 |
| 12/8/11 | 100.115 | 125.538 |
| 12/9/11 | 99.872 | 125.454 |
| 12/12/11 | 99.867 | 125.317 |
| 12/13/11 | 99.906 | 125.158 |
| 12/14/11 | 100 | 124.913 |
| 12/15/11 | 100.134 | 124.961 |
| 12/16/11 | 100.313 | 125.058 |
| 12/19/11 | 100.375 | 124.938 |
| 12/20/11 | 100.196 | 125.175 |
| 12/21/11 | 100.097 | 125.223 |
| 12/22/11 | 100.134 | 125.503 |
| 12/23/11 | 100.016 | 125.63 |
| 12/27/11 | 99.947 | 125.464 |
| 12/28/11 | 100.421 | 125.864 |
| 12/29/11 | 100.555 | 126.044 |
| 12/30/11 | 100.774 | 126.162 |
| 1/3/12 | 100.742 | 126.521 |
| 1/4/12 | 100.597 | 126.529 |
| 1/5/12 | 100.548 | 126.663 |
| 1/6/12 | 100.672 | 126.824 |
| 1/9/12 | 100.818 | 127.016 |
| 1/10/12 | 100.91 | 127.393 |
| 1/11/12 | 101.119 | 127.414 |
| 1/12/12 | 101.246 | 127.571 |
| 1/13/12 | 101.324 | 127.463 |
| 1/17/12 | 101.365 | 127.36 |
| 1/18/12 | 101.455 | 127.435 |
| 1/19/12 | 101.448 | 128.026 |
| 1/20/12 | 101.421 | 128.07 |
| 1/23/12 | 101.433 | 128.175 |
| 1/24/12 | 101.349 | 128.221 |
| 1/25/12 | 101.65 | 128.487 |
| 1/26/12 | 102.102 | 129.167 |
| 1/27/12 | 102.266 | 129.213 |
| 1/30/12 | 102.431 | 129.164 |
| 1/31/12 | 102.58 | 129.039 |
| 2/1/12 | 102.574 | 129.405 |
| 2/2/12 | 102.767 | 129.511 |
| 2/3/12 | 102.65 | 129.574 |
| 2/6/12 | 102.774 | 129.798 |
| 2/7/12 | 102.668 | 129.809 |
| 2/8/12 | 102.826 | 130.217 |
| 2/9/12 | 102.679 | 130.377 |
| 2/10/12 | 102.743 | 130.002 |
| 2/13/12 | 102.811 | 130.239 |
| 2/14/12 | 102.821 | 130.083 |
| 2/15/12 | 102.83 | 130.106 |
| 2/16/12 | 102.429 | 129.967 |
| 2/17/12 | 102.479 | 130.307 |
| 2/21/12 | 102.463 | 130.284 |
| 2/22/12 | 102.57 | 130.67 |
| 2/23/12 | 102.664 | 130.956 |
| 2/24/12 | 102.855 | 131.597 |
| 2/27/12 | 103.004 | 131.368 |
| 2/28/12 | 103.144 | 131.529 |
| 2/29/12 | 103.205 | 131.808 |
| 3/1/12 | 103.025 | 131.852 |
| 3/2/12 | 103.284 | 131.736 |
| 3/5/12 | 103.056 | 131.389 |
| 3/6/12 | 102.929 | 130.339 |
| 3/7/12 | 102.889 | 130.576 |
| 3/8/12 | 102.775 | 130.669 |
| 3/9/12 | 102.69 | 131.049 |
| 3/12/12 | 102.756 | 131.049 |
| 3/13/12 | 102.485 | 131.146 |
| 3/14/12 | 102.022 | 131.244 |
| 3/15/12 | 101.978 | 131.069 |
| 3/16/12 | 102.017 | 131.099 |
| 3/19/12 | 101.918 | 130.958 |
| 3/20/12 | 101.786 | 130.727 |
| 3/21/12 | 102.027 | 130.902 |
| 3/22/12 | 101.958 | 130.559 |
| 3/23/12 | 102.123 | 130.411 |
| 3/26/12 | 102.121 | 130.481 |
| 3/27/12 | 102.364 | 130.583 |
| 3/28/12 | 102.343 | 130.551 |
| 3/29/12 | 102.348 | 130.289 |
| 3/30/12 | 102.304 | 130.504 |
| 4/2/12 | 102.275 | 130.507 |
| 4/3/12 | 102.178 | 130.54 |
| 4/4/12 | 101.896 | 130.313 |
| 4/5/12 | 101.959 | 130.066 |
| 4/9/12 | 102.29 | 129.724 |
| 4/10/12 | 102.336 | 129.341 |
| 4/11/12 | 102.227 | 129.316 |
| 4/12/12 | 102.258 | 129.646 |
| 4/13/12 | 102.438 | 129.816 |
| 4/16/12 | 102.512 | 129.715 |
| 4/17/12 | 102.447 | 129.998 |
| 4/18/12 | 102.478 | 130.062 |
| 4/19/12 | 102.542 | 130 |
| 4/20/12 | 102.456 | 130.072 |
| 4/23/12 | 102.528 | 129.844 |
| 4/24/12 | 102.45 | 130.122 |
| 4/25/12 | 102.376 | 130.54 |
| 4/26/12 | 102.526 | 130.61 |
| 4/27/12 | 102.624 | 130.774 |
| 4/30/12 | 102.764 | 131.097 |
| 5/1/12 | 102.747 | 131.422 |
| 5/2/12 | 102.891 | 131.549 |
| 5/3/12 | 102.958 | 131.559 |
| 5/4/12 | 103.036 | 131.564 |
| 5/7/12 | 102.967 | 131.646 |
| 5/8/12 | 103.069 | 131.43 |
| 5/9/12 | 102.922 | 131.22 |
| 5/10/12 | 102.853 | 131.368 |
| 5/11/12 | 102.937 | 131.343 |
| 5/14/12 | 102.896 | 130.719 |
| 5/15/12 | 102.777 | 130.618 |
| 5/16/12 | 102.436 | 130.036 |
| 5/17/12 | 102.22 | 128.787 |
| 5/18/12 | 102.02 | 128.397 |
| 5/21/12 | 101.935 | 127.807 |
| 5/22/12 | 101.836 | 128.404 |
| 5/23/12 | 101.909 | 128.029 |
| 5/24/12 | 101.806 | 128.076 |
| 5/25/12 | 101.934 | 128.245 |
| 5/29/12 | 102 | 128.512 |
| 5/30/12 | 102.241 | 128.252 |
| 5/31/12 | 102.454 | 128.088 |
| 6/1/12 | 102.529 | 127.354 |
| 6/4/12 | 102.342 | 126.898 |
| 6/5/12 | 102.151 | 126.694 |
| 6/6/12 | 102.104 | 127.566 |
| 6/7/12 | 102.302 | 128.314 |
| 6/8/12 | 102.404 | 128.144 |
| 6/11/12 | 102.405 | 128.406 |
| 6/12/12 | 102.158 | 128.202 |
| 6/13/12 | 102.242 | 128.297 |
| 6/14/12 | 102.219 | 128.278 |
| 6/15/12 | 102.624 | 128.671 |
| 6/18/12 | 102.678 | 128.831 |
| 6/19/12 | 102.678 | 129.471 |
| 6/20/12 | 102.731 | 129.982 |
| 6/21/12 | 102.928 | 130.01 |
| 6/22/12 | 102.86 | 129.877 |
| 6/25/12 | 102.926 | 129.569 |
| 6/26/12 | 102.827 | 129.662 |
| 6/27/12 | 102.871 | 129.855 |
| 6/28/12 | 102.95 | 129.949 |
| 6/29/12 | 102.908 | 130.465 |
| 7/2/12 | 103.372 | 130.772 |
| 7/3/12 | 103.438 | 131.071 |
| 7/5/12 | 103.483 | 131.238 |
| 7/6/12 | 103.617 | 131.405 |
| 7/9/12 | 103.743 | 131.298 |
| 7/10/12 | 103.882 | 131.313 |
| 7/11/12 | 103.974 | 131.355 |
| 7/12/12 | 104.078 | 130.988 |
| 7/13/12 | 104.213 | 131.017 |
| 7/16/12 | 104.502 | 130.976 |
| 7/17/12 | 104.542 | 130.994 |
| 7/18/12 | 104.84 | 131.143 |
| 7/19/12 | 104.904 | 131.518 |
| 7/20/12 | 104.869 | 131.357 |
| 7/23/12 | 104.76 | 131.103 |
| 7/24/12 | 104.857 | 130.931 |
| 7/25/12 | 104.856 | 130.805 |
| 7/26/12 | 104.899 | 131.091 |
| 7/27/12 | 104.627 | 131.355 |
| 7/30/12 | 104.84 | 131.604 |
| 7/31/12 | 105.028 | 131.948 |
| 8/1/12 | 104.967 | 132.255 |
| 8/2/12 | 105.058 | 132.124 |
| 8/3/12 | 104.808 | 132.261 |
| 8/6/12 | 105.018 | 132.559 |
| 8/7/12 | 104.746 | 132.745 |
| 8/8/12 | 104.638 | 132.59 |
| 8/9/12 | 104.469 | 132.581 |
| 8/10/12 | 104.646 | 132.362 |
| 8/13/12 | 104.659 | 132.342 |
| 8/14/12 | 104.381 | 132.345 |
| 8/15/12 | 104.02 | 132.073 |
| 8/16/12 | 103.908 | 132.068 |
| 8/17/12 | 103.944 | 132.003 |
| 8/20/12 | 103.998 | 132.164 |
| 8/21/12 | 104.025 | 132.365 |
| 8/22/12 | 104.353 | 132.42 |
| 8/23/12 | 104.574 | 132.471 |
| 8/24/12 | 104.535 | 132.536 |
| 8/27/12 | 104.634 | 132.588 |
| 8/28/12 | 104.679 | 132.662 |
| 8/29/12 | 104.564 | 132.576 |
| 8/30/12 | 104.666 | 132.748 |
| 8/31/12 | 104.854 | 132.757 |
| 9/4/12 | 104.974 | 132.816 |
| 9/5/12 | 104.888 | 132.819 |
| 9/6/12 | 104.737 | 133.125 |
| 9/7/12 | 104.978 | 133.605 |
| 9/10/12 | 104.878 | 133.705 |
| 9/11/12 | 104.922 | 134.088 |
| 9/12/12 | 104.881 | 134.64 |
| 9/13/12 | 104.964 | 134.936 |
| 9/14/12 | 104.926 | 135.468 |
| 9/17/12 | 105.058 | 135.563 |
| 9/18/12 | 105.16 | 135.387 |
| 9/19/12 | 105.306 | 135.375 |
| 9/20/12 | 105.214 | 135.117 |
| 9/21/12 | 105.236 | 135.047 |
| 9/24/12 | 105.353 | 134.578 |
| 9/25/12 | 105.333 | 134.277 |
| 9/26/12 | 105.396 | 133.268 |
| 9/27/12 | 105.535 | 133.642 |
| 9/28/12 | 105.652 | 133.797 |
| 10/1/12 | 105.785 | 133.896 |
| 10/2/12 | 105.876 | 133.835 |
| 10/3/12 | 105.971 | 133.992 |
| 10/4/12 | 106.042 | 134.162 |
| 10/5/12 | 105.919 | 134.321 |
| 10/8/12 | 105.81 | 134.45 |
| 10/9/12 | 105.946 | 134.131 |
| 10/10/12 | 105.923 | 133.801 |
| 10/11/12 | 106.139 | 134.188 |
| 10/12/12 | 106.424 | 134.299 |
| 10/15/12 | 106.445 | 134.521 |
| 10/16/12 | 106.447 | 134.767 |
| 10/17/12 | 106.444 | 135.122 |
| 10/18/12 | 106.326 | 135.204 |
| 10/19/12 | 106.271 | 135.012 |
| 10/22/12 | 106.114 | 134.922 |
| 10/23/12 | 105.996 | 134.365 |
| 10/24/12 | 105.971 | 134.527 |
| 10/25/12 | 105.806 | 134.564 |
| 10/26/12 | 105.938 | 134.21 |
| 10/29/12 | 105.958 | 134.185 |
| 10/30/12 | 105.958 | 134.185 |
| 10/31/12 | 106.102 | 134.104 |
| 11/1/12 | 106.069 | 134.15 |
| 11/2/12 | 106.005 | 134.287 |
| 11/5/12 | 106.032 | 134.281 |
| 11/6/12 | 105.82 | 134.439 |
| 11/7/12 | 105.9 | 133.937 |
| 11/8/12 | 105.923 | 133.875 |
| 11/9/12 | 105.877 | 133.542 |
| 11/12/12 | 105.86 | 133.603 |
| 11/13/12 | 105.873 | 133.044 |
| 11/14/12 | 105.848 | 132.789 |
| 11/15/12 | 105.744 | 132.136 |
| 11/16/12 | 105.693 | 131.979 |
| 11/19/12 | 105.653 | 132.5 |
| 11/20/12 | 105.532 | 132.869 |
| 11/21/12 | 105.358 | 132.945 |
| 11/23/12 | 105.388 | 133.147 |
| 11/26/12 | 105.534 | 133.19 |
| 11/27/12 | 105.586 | 133.501 |
| 11/28/12 | 105.642 | 133.554 |
| 11/29/12 | 105.643 | 133.926 |
| 11/30/12 | 105.715 | 134.285 |
| 12/3/12 | 105.696 | 134.168 |
| 12/4/12 | 105.727 | 134.386 |
| 12/5/12 | 105.874 | 134.874 |
| 12/6/12 | 105.901 | 135.085 |
| 12/7/12 | 105.741 | 135.362 |
| 12/10/12 | 105.722 | 135.452 |
| 12/11/12 | 105.635 | 135.61 |
| 12/12/12 | 105.563 | 135.761 |
| 12/13/12 | 105.422 | 135.826 |
| 12/14/12 | 105.506 | 135.725 |
| 12/17/12 | 105.385 | 135.641 |
| 12/18/12 | 105.191 | 135.742 |
| 12/19/12 | 105.36 | 135.775 |
| 12/20/12 | 105.386 | 135.706 |
| 12/21/12 | 105.493 | 135.434 |
| 12/24/12 | 105.382 | 135.434 |
| 12/26/12 | 105.438 | 135.223 |
| 12/27/12 | 105.63 | 135.36 |
| 12/28/12 | 105.717 | 135.388 |
| 12/31/12 | 105.623 | 135.388 |
| 1/2/13 | 105.494 | 136.004 |
| 1/3/13 | 105.419 | 136.223 |
| 1/4/13 | 105.349 | 136.418 |
| 1/7/13 | 105.428 | 136.539 |
| 1/8/13 | 105.485 | 136.567 |
| 1/9/13 | 105.45 | 136.666 |
| 1/10/13 | 105.382 | 136.791 |
| 1/11/13 | 105.347 | 136.887 |
| 1/14/13 | 105.372 | 136.76 |
| 1/15/13 | 105.348 | 136.538 |
| 1/16/13 | 105.332 | 136.64 |
| 1/17/13 | 105.127 | 136.744 |
| 1/18/13 | 105.195 | 136.872 |
| 1/22/13 | 105.239 | 136.901 |
| 1/23/13 | 105.259 | 137.065 |
| 1/24/13 | 105.154 | 137.18 |
| 1/25/13 | 104.918 | 137.344 |
| 1/28/13 | 104.671 | 137.292 |
| 1/29/13 | 104.628 | 136.915 |
| 1/30/13 | 104.462 | 136.633 |
| 1/31/13 | 104.489 | 136.183 |
| 2/1/13 | 104.509 | 136.3 |
| 2/4/13 | 104.516 | 135.996 |
| 2/5/13 | 104.38 | 135.778 |
| 2/6/13 | 104.452 | 135.607 |
| 2/7/13 | 104.557 | 135.447 |
| 2/8/13 | 104.482 | 135.313 |
| 2/11/13 | 104.548 | 135.322 |
| 2/12/13 | 104.435 | 135.393 |
| 2/13/13 | 104.331 | 135.446 |
| 2/14/13 | 104.432 | 135.524 |
| 2/15/13 | 104.394 | 135.504 |
| 2/19/13 | 104.387 | 135.572 |
| 2/20/13 | 104.348 | 135.627 |
| 2/21/13 | 104.499 | 135.402 |
| 2/22/13 | 104.557 | 135.485 |
| 2/25/13 | 104.756 | 135.664 |
| 2/26/13 | 104.841 | 135.55 |
| 2/27/13 | 104.778 | 135.597 |
| 2/28/13 | 104.777 | 135.799 |
| 3/1/13 | 104.858 | 135.684 |
| 3/4/13 | 104.85 | 135.753 |
| 3/5/13 | 104.754 | 136.111 |
| 3/6/13 | 104.599 | 136.122 |
| 3/7/13 | 104.412 | 136.133 |
| 3/8/13 | 104.18 | 136.117 |
| 3/11/13 | 104.184 | 136.2 |
| 3/12/13 | 104.331 | 136.304 |
| 3/13/13 | 104.278 | 136.283 |
| 3/14/13 | 104.276 | 136.504 |
| 3/15/13 | 104.401 | 136.543 |
| 3/18/13 | 104.535 | 136.549 |
| 3/19/13 | 104.67 | 136.561 |
| 3/20/13 | 104.466 | 136.574 |
| 3/21/13 | 104.428 | 136.487 |
| 3/22/13 | 104.404 | 136.502 |
| 3/25/13 | 104.386 | 136.448 |
| 3/26/13 | 104.316 | 136.408 |
| 3/27/13 | 104.488 | 136.442 |
| 3/28/13 | 104.489 | 136.483 |
| 4/1/13 | 104.516 | 136.479 |
| 4/2/13 | 104.463 | 136.55 |
| 4/3/13 | 104.642 | 136.537 |
| 4/4/13 | 104.92 | 136.53 |
| 4/5/13 | 105.293 | 136.496 |
| 4/8/13 | 105.29 | 136.464 |
| 4/9/13 | 105.304 | 136.717 |
| 4/10/13 | 105.125 | 136.822 |
| 4/11/13 | 105.12 | 137.05 |
| 4/12/13 | 105.316 | 137.192 |
| 4/15/13 | 105.424 | 137.038 |
| 4/16/13 | 105.369 | 137.111 |
| 4/17/13 | 105.389 | 136.936 |
| 4/18/13 | 105.407 | 136.862 |
| 4/19/13 | 105.346 | 136.955 |
| 4/22/13 | 105.406 | 137.056 |
| 4/23/13 | 105.46 | 137.317 |
| 4/24/13 | 105.498 | 137.459 |
| 4/25/13 | 105.38 | 137.639 |
| 4/26/13 | 105.595 | 137.856 |
| 4/29/13 | 105.615 | 138.038 |
| 4/30/13 | 105.612 | 138.388 |
| 5/1/13 | 105.781 | 138.733 |
| 5/2/13 | 105.844 | 138.955 |
| 5/3/13 | 105.494 | 139.201 |
| 5/6/13 | 105.353 | 139.261 |
| 5/7/13 | 105.329 | 139.46 |
| 5/8/13 | 105.359 | 139.652 |
| 5/9/13 | 105.342 | 139.604 |
| 5/10/13 | 104.923 | 139.359 |
| 5/13/13 | 104.727 | 138.947 |
| 5/14/13 | 104.694 | 138.789 |
| 5/15/13 | 104.673 | 138.724 |
| 5/16/13 | 104.927 | 138.831 |
| 5/17/13 | 104.738 | 138.852 |
| 5/20/13 | 104.621 | 138.896 |
| 5/21/13 | 104.661 | 138.85 |
| 5/22/13 | 104.462 | 138.759 |
| 5/23/13 | 104.301 | 138.269 |
| 5/24/13 | 104.298 | 138.075 |
| 5/28/13 | 103.825 | 137.844 |
| 5/29/13 | 103.525 | 137.043 |
| 5/30/13 | 103.475 | 136.973 |
| 5/31/13 | 103.159 | 136.601 |
| 6/3/13 | 103.169 | 135.944 |
| 6/4/13 | 102.987 | 135.582 |
| 6/5/13 | 102.781 | 134.538 |
| 6/6/13 | 102.788 | 134.224 |
| 6/7/13 | 102.678 | 135.191 |
| 6/10/13 | 102.314 | 134.939 |
| 6/11/13 | 101.98 | 133.85 |
| 6/12/13 | 102.018 | 134.087 |
| 6/13/13 | 102.11 | 133.805 |
| 6/14/13 | 102.545 | 134.401 |
| 6/17/13 | 102.474 | 134.746 |
| 6/18/13 | 102.164 | 134.589 |
| 6/19/13 | 101.914 | 134.457 |
| 6/20/13 | 100.588 | 132.485 |
| 6/21/13 | 100.219 | 132.116 |
| 6/24/13 | 99.311 | 130.267 |
| 6/25/13 | 99.469 | 130.422 |
| 6/26/13 | 99.857 | 131.058 |
| 6/27/13 | 100.266 | 131.995 |
| 6/28/13 | 100.357 | 132.199 |
| 7/1/13 | 100.575 | 132.38 |
| 7/2/13 | 100.774 | 132.5 |
| 7/3/13 | 100.789 | 132.233 |
| 7/5/13 | 100.052 | 132.062 |
| 7/8/13 | 100.063 | 131.702 |
| 7/9/13 | 100.261 | 131.99 |
| 7/10/13 | 100.23 | 132.194 |
| 7/11/13 | 100.65 | 133.132 |
| 7/12/13 | 100.778 | 133.422 |
| 7/15/13 | 100.866 | 133.956 |
| 7/16/13 | 101.036 | 134.184 |
| 7/17/13 | 101.286 | 134.476 |
| 7/18/13 | 101.274 | 135.077 |
| 7/19/13 | 101.435 | 135.209 |
| 7/22/13 | 101.6 | 135.45 |
| 7/23/13 | 101.546 | 135.437 |
| 7/24/13 | 101.125 | 134.763 |
| 7/25/13 | 100.927 | 134.065 |
| 7/26/13 | 101.109 | 134.013 |
| 7/29/13 | 101.003 | 133.854 |
| 7/30/13 | 100.974 | 133.888 |
| 7/31/13 | 100.761 | 133.596 |
| 8/1/13 | 100.577 | 133.583 |
| 8/2/13 | 100.839 | 133.403 |
| 8/5/13 | 100.724 | 133.206 |
| 8/6/13 | 100.666 | 132.905 |
| 8/7/13 | 100.771 | 132.644 |
| 8/8/13 | 100.906 | 132.743 |
| 8/9/13 | 100.882 | 132.811 |
| 8/12/13 | 100.814 | 132.845 |
| 8/13/13 | 100.327 | 132.628 |
| 8/14/13 | 100.232 | 132.676 |
| 8/15/13 | 99.756 | 132.339 |
| 8/16/13 | 99.565 | 132.204 |
| 8/19/13 | 99.254 | 131.767 |
| 8/20/13 | 99.406 | 131.634 |
| 8/21/13 | 99.234 | 131.571 |
| 8/22/13 | 99.051 | 131.404 |
| 8/23/13 | 99.367 | 131.617 |
| 8/26/13 | 99.636 | 131.681 |
| 8/27/13 | 99.89 | 131.589 |
| 8/28/13 | 99.751 | 131.599 |
| 8/29/13 | 99.819 | 131.721 |
| 8/30/13 | 99.969 | 131.931 |
| 9/3/13 | 99.443 | 131.767 |
| 9/4/13 | 99.4 | 131.735 |
| 9/5/13 | 98.833 | 131.503 |
| 9/6/13 | 99.036 | 131.534 |
| 9/9/13 | 99.126 | 131.762 |
| 9/10/13 | 98.881 | 131.688 |
| 9/11/13 | 98.985 | 131.774 |
| 9/12/13 | 99.199 | 132.012 |
| 9/13/13 | 99.132 | 132.108 |
| 9/16/13 | 99.445 | 132.49 |
| 9/17/13 | 99.387 | 132.526 |
| 9/18/13 | 99.587 | 132.801 |
| 9/19/13 | 100.13 | 133.454 |
| 9/20/13 | 100.145 | 133.463 |
| 9/23/13 | 100.222 | 133.158 |
| 9/24/13 | 100.458 | 133.178 |
| 9/25/13 | 100.57 | 133.037 |
| 9/26/13 | 100.459 | 132.947 |
| 9/27/13 | 100.477 | 132.761 |
| 9/30/13 | 100.36 | 132.403 |
| 10/1/13 | 100.351 | 132.559 |
| 10/2/13 | 100.5 | 132.65 |
| 10/3/13 | 100.614 | 132.895 |
| 10/4/13 | 100.436 | 132.974 |
| 10/7/13 | 100.499 | 133.004 |
| 10/8/13 | 100.458 | 132.84 |
| 10/9/13 | 100.359 | 132.765 |
| 10/10/13 | 100.309 | 133.012 |
| 10/11/13 | 100.536 | 133.183 |
| 10/14/13 | 100.578 | 133.263 |
| 10/15/13 | 100.404 | 133.285 |
| 10/16/13 | 100.541 | 133.539 |
| 10/17/13 | 101.066 | 134.085 |
| 10/18/13 | 101.3 | 134.484 |
| 10/21/13 | 101.202 | 134.622 |
| 10/22/13 | 101.507 | 134.843 |
| 10/23/13 | 101.575 | 134.752 |
| 10/24/13 | 101.454 | 134.8 |
| 10/25/13 | 101.475 | 134.836 |
| 10/28/13 | 101.432 | 134.984 |
| 10/29/13 | 101.425 | 134.988 |
| 10/30/13 | 101.524 | 135.037 |
| 10/31/13 | 101.352 | 135.022 |
| 11/1/13 | 101.143 | 134.905 |
| 11/4/13 | 101.125 | 135.008 |
| 11/5/13 | 100.846 | 134.753 |
| 11/6/13 | 100.906 | 134.761 |
| 11/7/13 | 100.99 | 134.746 |
| 11/8/13 | 100.473 | 134.373 |
| 11/11/13 | 100.506 | 134.437 |
| 11/12/13 | 100.257 | 134.002 |
| 11/13/13 | 100.423 | 133.829 |
| 11/14/13 | 100.717 | 134.11 |
| 11/15/13 | 100.772 | 134.271 |
| 11/18/13 | 101.031 | 134.561 |
| 11/19/13 | 100.928 | 134.495 |
| 11/20/13 | 100.749 | 134.418 |
| 11/21/13 | 100.578 | 134.251 |
| 11/22/13 | 100.784 | 134.462 |
| 11/25/13 | 100.926 | 134.532 |
| 11/26/13 | 101.066 | 134.489 |
| 11/27/13 | 100.968 | 134.694 |
| 11/29/13 | 100.926 | 134.769 |
| 12/2/13 | 100.715 | 134.59 |
| 12/3/13 | 100.783 | 134.592 |
| 12/4/13 | 100.522 | 134.448 |
| 12/5/13 | 100.422 | 134.378 |
| 12/6/13 | 100.434 | 134.486 |
| 12/9/13 | 100.55 | 134.531 |
| 12/10/13 | 100.804 | 134.606 |
| 12/11/13 | 100.783 | 134.549 |
| 12/12/13 | 100.616 | 134.316 |
| 12/13/13 | 100.656 | 134.34 |
| 12/16/13 | 100.77 | 134.355 |
| 12/17/13 | 100.883 | 134.318 |
| 12/18/13 | 100.862 | 134.256 |
| 12/19/13 | 100.784 | 134.28 |
| 12/20/13 | 100.91 | 134.382 |
| 12/23/13 | 100.94 | 134.459 |
| 12/24/13 | 100.826 | 134.433 |
| 12/26/13 | 100.715 | 134.462 |
| 12/27/13 | 100.661 | 134.544 |
| 12/30/13 | 100.78 | 134.644 |
| 12/31/13 | 100.835 | 134.665 |
| 1/2/14 | 100.818 | 134.61 |
| 1/3/14 | 100.821 | 134.675 |
| 1/6/14 | 100.947 | 134.841 |
| 1/7/14 | 100.979 | 135.053 |
| 1/8/14 | 100.662 | 135.04 |
| 1/9/14 | 100.703 | 135.072 |
| 1/10/14 | 101.104 | 135.228 |
| 1/13/14 | 101.302 | 135.332 |
| 1/14/14 | 101.168 | 135.33 |
| 1/15/14 | 101.05 | 135.493 |
| 1/16/14 | 101.186 | 135.513 |
| 1/17/14 | 101.214 | 135.694 |
| 1/21/14 | 101.237 | 135.657 |
| 1/22/14 | 101.077 | 135.696 |
| 1/23/14 | 101.165 | 135.526 |
| 1/24/14 | 101.225 | 135.025 |
| 1/27/14 | 101.165 | 134.766 |
| 1/28/14 | 101.185 | 134.798 |
| 1/29/14 | 101.336 | 134.736 |
| 1/30/14 | 101.366 | 134.782 |
| 1/31/14 | 101.431 | 134.664 |
| 2/3/14 | 101.636 | 134.541 |
| 2/4/14 | 101.583 | 134.457 |
| 2/5/14 | 101.42 | 134.361 |
| 2/6/14 | 101.393 | 134.536 |
| 2/7/14 | 101.592 | 134.888 |
| 2/10/14 | 101.615 | 135.076 |
| 2/11/14 | 101.498 | 135.216 |
| 2/12/14 | 101.418 | 135.441 |
| 2/13/14 | 101.69 | 135.543 |
| 2/14/14 | 101.753 | 135.746 |
| 2/18/14 | 101.892 | 135.952 |
| 2/19/14 | 101.879 | 136.044 |
| 2/20/14 | 101.613 | 136.097 |
| 2/21/14 | 101.699 | 136.258 |
| 2/24/14 | 101.732 | 136.482 |
| 2/25/14 | 101.989 | 136.691 |
| 2/26/14 | 102.079 | 136.809 |
| 2/27/14 | 102.222 | 136.918 |
| 2/28/14 | 102.211 | 137.009 |
| 3/3/14 | 102.364 | 136.884 |
| 3/4/14 | 102.118 | 136.915 |
| 3/5/14 | 102.048 | 136.916 |
| 3/6/14 | 101.816 | 136.684 |
| 3/7/14 | 101.497 | 136.459 |
| 3/10/14 | 101.461 | 136.253 |
| 3/11/14 | 101.46 | 136.252 |
| 3/12/14 | 101.557 | 136.142 |
| 3/13/14 | 101.718 | 136.026 |
| 3/14/14 | 101.769 | 135.809 |
| 3/17/14 | 101.717 | 135.965 |
| 3/18/14 | 101.749 | 136.072 |
| 3/19/14 | 101.649 | 136.191 |
| 3/20/14 | 101.412 | 135.875 |
| 3/21/14 | 101.566 | 136.086 |
| 3/24/14 | 101.667 | 136.015 |
| 3/25/14 | 101.737 | 136.04 |
| 3/26/14 | 101.878 | 136.252 |
| 3/27/14 | 101.987 | 136.119 |
| 3/28/14 | 101.878 | 136.233 |
| 3/31/14 | 101.852 | 136.266 |
| 4/1/14 | 101.868 | 136.261 |
| 4/2/14 | 101.643 | 136.321 |
| 4/3/14 | 101.764 | 136.337 |
| 4/4/14 | 102.025 | 136.448 |
| 4/7/14 | 102.21 | 136.349 |
| 4/8/14 | 102.242 | 136.393 |
| 4/9/14 | 102.266 | 136.486 |
| 4/10/14 | 102.532 | 136.521 |
| 4/11/14 | 102.573 | 136.311 |
| 4/14/14 | 102.531 | 136.308 |
| 4/15/14 | 102.544 | 136.227 |
| 4/16/14 | 102.487 | 136.253 |
| 4/17/14 | 102.346 | 136.257 |
| 4/21/14 | 102.277 | 136.247 |
| 4/22/14 | 102.207 | 136.279 |
| 4/23/14 | 102.343 | 136.332 |
| 4/24/14 | 102.303 | 136.334 |
| 4/25/14 | 102.421 | 136.355 |
| 4/28/14 | 102.328 | 136.308 |
| 4/29/14 | 102.243 | 136.341 |
| 4/30/14 | 102.413 | 136.464 |
| 5/1/14 | 102.654 | 136.42 |
| 5/2/14 | 102.735 | 136.585 |
| 5/5/14 | 102.752 | 136.518 |
| 5/6/14 | 102.75 | 136.554 |
| 5/7/14 | 102.757 | 136.59 |
| 5/8/14 | 102.825 | 136.629 |
| 5/9/14 | 102.765 | 136.738 |
| 5/12/14 | 102.608 | 136.757 |
| 5/13/14 | 102.76 | 136.86 |
| 5/14/14 | 103.095 | 136.951 |
| 5/15/14 | 103.233 | 136.892 |
| 5/16/14 | 103.154 | 136.848 |
| 5/19/14 | 103.118 | 136.968 |
| 5/20/14 | 103.068 | 136.874 |
| 5/21/14 | 102.909 | 136.849 |
| 5/22/14 | 102.817 | 136.739 |
| 5/23/14 | 102.956 | 136.771 |
| 5/27/14 | 102.996 | 136.726 |
| 5/28/14 | 103.368 | 136.78 |
| 5/29/14 | 103.4 | 136.844 |
| 5/30/14 | 103.25 | 136.989 |
| 6/2/14 | 102.997 | 137.03 |
| 6/3/14 | 102.747 | 136.843 |
| 6/4/14 | 102.639 | 136.861 |
| 6/5/14 | 102.724 | 137.095 |
| 6/6/14 | 102.858 | 137.239 |
| 6/9/14 | 102.774 | 137.321 |
| 6/10/14 | 102.652 | 137.409 |
| 6/11/14 | 102.666 | 137.46 |
| 6/12/14 | 102.706 | 137.448 |
| 6/13/14 | 102.744 | 137.427 |
| 6/16/14 | 102.763 | 137.473 |
| 6/17/14 | 102.566 | 137.403 |
| 6/18/14 | 102.647 | 137.424 |
| 6/19/14 | 102.775 | 137.698 |
| 6/20/14 | 102.697 | 137.723 |
| 6/23/14 | 102.846 | 137.779 |
| 6/24/14 | 102.88 | 137.797 |
| 6/25/14 | 103.059 | 137.699 |
| 6/26/14 | 103.117 | 137.613 |
| 6/27/14 | 103.111 | 137.582 |
| 6/30/14 | 103.096 | 137.543 |
| 7/1/14 | 102.92 | 137.521 |
| 7/2/14 | 102.692 | 137.487 |
| 7/3/14 | 102.53 | 137.445 |
| 7/7/14 | 102.607 | 137.369 |
| 7/8/14 | 102.82 | 137.259 |
| 7/9/14 | 102.778 | 137.102 |
| 7/10/14 | 102.892 | 136.873 |
| 7/11/14 | 102.97 | 136.858 |
| 7/14/14 | 102.883 | 136.783 |
| 7/15/14 | 102.808 | 136.662 |
| 7/16/14 | 102.837 | 136.489 |
| 7/17/14 | 103.023 | 136.093 |
| 7/18/14 | 102.976 | 135.884 |
| 7/21/14 | 103.018 | 135.786 |
| 7/22/14 | 103.027 | 135.911 |
| 7/23/14 | 103.133 | 136.146 |
| 7/24/14 | 102.926 | 136.135 |
| 7/25/14 | 103.053 | 136.103 |
| 7/28/14 | 103.005 | 135.916 |
| 7/29/14 | 103.084 | 135.842 |
| 7/30/14 | 102.775 | 135.555 |
| 7/31/14 | 102.536 | 134.442 |
| 8/1/14 | 102.65 | 133.751 |
| 8/4/14 | 102.794 | 133.906 |
| 8/5/14 | 102.693 | 134.262 |
| 8/6/14 | 102.743 | 134.202 |
| 8/7/14 | 102.903 | 134.308 |
| 8/8/14 | 103.015 | 134.39 |
| 8/11/14 | 102.911 | 134.76 |
| 8/12/14 | 102.848 | 134.962 |
| 8/13/14 | 102.947 | 135.352 |
| 8/14/14 | 103.093 | 135.465 |
| 8/15/14 | 103.336 | 135.579 |
| 8/18/14 | 103.224 | 135.868 |
| 8/19/14 | 103.166 | 136.06 |
| 8/20/14 | 103.049 | 136.102 |
| 8/21/14 | 103.116 | 136.129 |
| 8/22/14 | 103.16 | 136.109 |
| 8/25/14 | 103.266 | 136.118 |
| 8/26/14 | 103.305 | 136.212 |
| 8/27/14 | 103.386 | 136.164 |
| 8/28/14 | 103.533 | 136.214 |
| 8/29/14 | 103.569 | 136.23 |
| 9/2/14 | 103.224 | 136.057 |
| 9/3/14 | 103.152 | 135.89 |
| 9/4/14 | 102.992 | 135.641 |
| 9/5/14 | 102.979 | 135.338 |
| 9/8/14 | 102.91 | 135.188 |
| 9/9/14 | 102.636 | 134.826 |
| 9/10/14 | 102.415 | 134.318 |
| 9/11/14 | 102.404 | 134.077 |
| 9/12/14 | 102.066 | 133.947 |
| 9/15/14 | 102.058 | 133.746 |
| 9/16/14 | 102.079 | 133.58 |
| 9/17/14 | 102.06 | 133.729 |
| 9/18/14 | 101.895 | 133.842 |
| 9/19/14 | 102.051 | 133.984 |
| 9/22/14 | 102.194 | 133.817 |
| 9/23/14 | 102.265 | 133.321 |
| 9/24/14 | 102.135 | 133.064 |
| 9/25/14 | 102.162 | 132.238 |
| 9/26/14 | 101.911 | 131.656 |
| 9/29/14 | 101.987 | 131.223 |
| 9/30/14 | 101.995 | 131.89 |
| 10/1/14 | 102.349 | 132.149 |
| 10/2/14 | 102.373 | 132.201 |
| 10/3/14 | 102.345 | 132.64 |
| 10/6/14 | 102.56 | 132.946 |
| 10/7/14 | 102.76 | 132.603 |
| 10/8/14 | 102.816 | 132.383 |
| 10/9/14 | 102.873 | 131.878 |
| 10/10/14 | 102.843 | 131.266 |
| 10/13/14 | 102.861 | 131.314 |
| 10/14/14 | 103.153 | 130.54 |
| 10/15/14 | 103.63 | 129.86 |
| 10/16/14 | 103.21 | 130.301 |
| 10/17/14 | 103.149 | 132.001 |
| 10/20/14 | 103.206 | 132.057 |
| 10/21/14 | 103.156 | 132.922 |
| 10/22/14 | 103.063 | 133.044 |
| 10/23/14 | 102.823 | 133.165 |
| 10/24/14 | 102.843 | 133.183 |
| 10/27/14 | 102.852 | 132.995 |
| 10/28/14 | 102.764 | 133.102 |
| 10/29/14 | 102.545 | 132.948 |
| 10/30/14 | 102.596 | 132.859 |
| 10/31/14 | 102.445 | 133.107 |
| 11/3/14 | 102.344 | 133.133 |
| 11/4/14 | 102.35 | 132.642 |
| 11/5/14 | 102.221 | 132.701 |
| 11/6/14 | 102.127 | 132.705 |
| 11/7/14 | 102.255 | 132.638 |
| 11/10/14 | 102.218 | 132.691 |
| 11/11/14 | 102.225 | 132.81 |
| 11/12/14 | 102.112 | 132.619 |
| 11/13/14 | 102.052 | 132.412 |
| 11/14/14 | 102.008 | 132.145 |
| 11/17/14 | 101.894 | 131.772 |
| 11/18/14 | 101.843 | 131.427 |
| 11/19/14 | 101.695 | 131.083 |
| 11/20/14 | 101.809 | 131.09 |
| 11/21/14 | 102.03 | 131.414 |
| 11/24/14 | 102.171 | 131.531 |
| 11/25/14 | 102.338 | 131.588 |
| 11/26/14 | 102.539 | 131.644 |
| 11/28/14 | 102.655 | 131.425 |
| 12/1/14 | 102.559 | 130.466 |
| 12/2/14 | 102.141 | 129.983 |
| 12/3/14 | 102.081 | 130.038 |
| 12/4/14 | 102.177 | 129.993 |
| 12/5/14 | 101.947 | 129.782 |
| 12/8/14 | 101.994 | 129.233 |
| 12/9/14 | 102.101 | 128.353 |
| 12/10/14 | 102.099 | 127.663 |
| 12/11/14 | 102.021 | 127.356 |
| 12/12/14 | 102.212 | 126.57 |
| 12/15/14 | 101.978 | 125.84 |
| 12/16/14 | 101.885 | 125.12 |
| 12/17/14 | 101.994 | 126.235 |
| 12/18/14 | 101.843 | 127.8 |
| 12/19/14 | 102.027 | 128.272 |
| 12/22/14 | 102.137 | 128.584 |
| 12/23/14 | 102.011 | 128.794 |
| 12/24/14 | 101.848 | 128.833 |
| 12/26/14 | 101.905 | 128.825 |
| 12/29/14 | 102.054 | 128.921 |
| 12/30/14 | 102.239 | 128.765 |
| 12/31/14 | 102.233 | 128.769 |